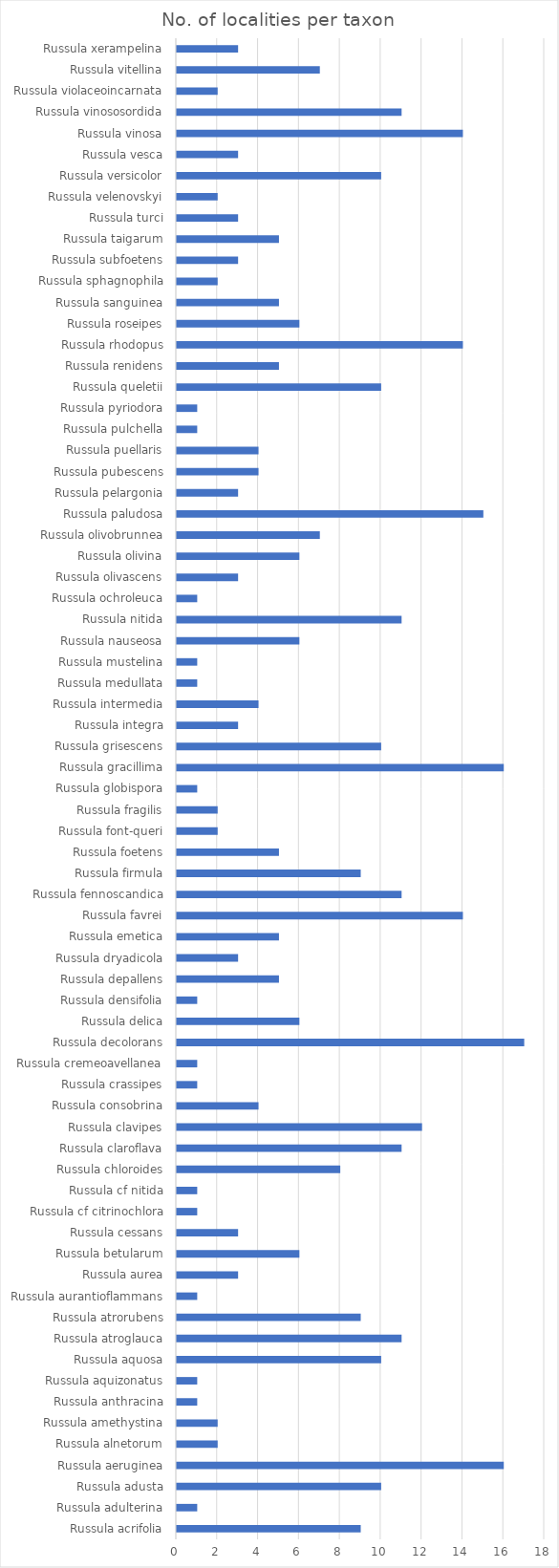
| Category | Series 0 |
|---|---|
| Russula acrifolia | 9 |
| Russula adulterina | 1 |
| Russula adusta | 10 |
| Russula aeruginea | 16 |
| Russula alnetorum | 2 |
| Russula amethystina | 2 |
| Russula anthracina | 1 |
| Russula aquizonatus | 1 |
| Russula aquosa | 10 |
| Russula atroglauca | 11 |
| Russula atrorubens | 9 |
| Russula aurantioflammans | 1 |
| Russula aurea | 3 |
| Russula betularum | 6 |
| Russula cessans | 3 |
| Russula cf citrinochlora | 1 |
| Russula cf nitida | 1 |
| Russula chloroides | 8 |
| Russula claroflava | 11 |
| Russula clavipes | 12 |
| Russula consobrina | 4 |
| Russula crassipes | 1 |
| Russula cremeoavellanea | 1 |
| Russula decolorans | 17 |
| Russula delica | 6 |
| Russula densifolia | 1 |
| Russula depallens | 5 |
| Russula dryadicola | 3 |
| Russula emetica | 5 |
| Russula favrei | 14 |
| Russula fennoscandica | 11 |
| Russula firmula | 9 |
| Russula foetens | 5 |
| Russula font-queri | 2 |
| Russula fragilis | 2 |
| Russula globispora | 1 |
| Russula gracillima | 16 |
| Russula grisescens | 10 |
| Russula integra | 3 |
| Russula intermedia | 4 |
| Russula medullata | 1 |
| Russula mustelina | 1 |
| Russula nauseosa | 6 |
| Russula nitida | 11 |
| Russula ochroleuca | 1 |
| Russula olivascens | 3 |
| Russula olivina | 6 |
| Russula olivobrunnea | 7 |
| Russula paludosa | 15 |
| Russula pelargonia | 3 |
| Russula pubescens | 4 |
| Russula puellaris | 4 |
| Russula pulchella | 1 |
| Russula pyriodora | 1 |
| Russula queletii | 10 |
| Russula renidens | 5 |
| Russula rhodopus | 14 |
| Russula roseipes | 6 |
| Russula sanguinea | 5 |
| Russula sphagnophila | 2 |
| Russula subfoetens | 3 |
| Russula taigarum | 5 |
| Russula turci | 3 |
| Russula velenovskyi | 2 |
| Russula versicolor | 10 |
| Russula vesca | 3 |
| Russula vinosa | 14 |
| Russula vinososordida | 11 |
| Russula violaceoincarnata | 2 |
| Russula vitellina | 7 |
| Russula xerampelina | 3 |